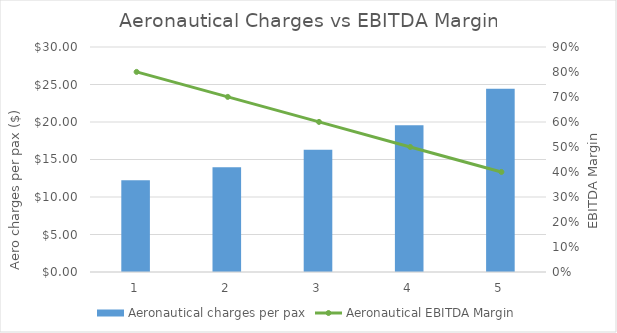
| Category | Aeronautical charges per pax |
|---|---|
| 0 | 12.22 |
| 1 | 13.964 |
| 2 | 16.292 |
| 3 | 19.554 |
| 4 | 24.444 |